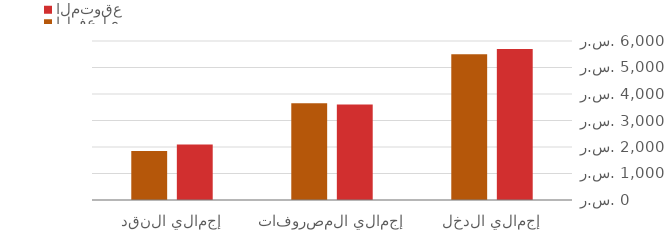
| Category | المتوقع | الفعلي |
|---|---|---|
| إجمالي الدخل | 5700 | 5500 |
| إجمالي المصروفات | 3603 | 3655 |
| إجمالي النقد | 2097 | 1845 |